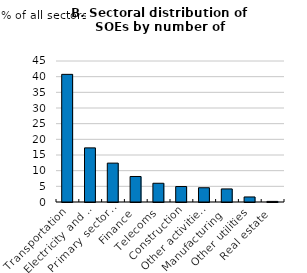
| Category | Number of employees |
|---|---|
| Transportation | 40.74 |
| Electricity and gas | 17.27 |
| Primary sectors   | 12.41 |
| Finance | 8.14 |
| Telecoms  | 5.98 |
| Construction | 4.94 |
| Other activities  | 4.55 |
| Manufacturing  | 4.17 |
| Other utilities  | 1.61 |
| Real estate  | 0.19 |